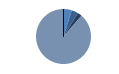
| Category | Series 0 |
|---|---|
| ARRASTRE | 19 |
| CERCO | 15 |
| PALANGRE | 10 |
| REDES DE ENMALLE | 0 |
| ARTES FIJAS | 0 |
| ARTES MENORES | 343 |
| SIN TIPO ASIGNADO | 0 |